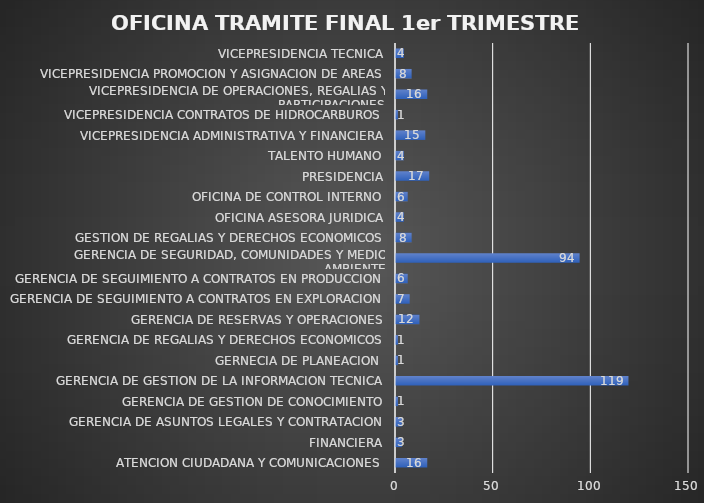
| Category | Series 0 |
|---|---|
| ATENCION CIUDADANA Y COMUNICACIONES | 16 |
| FINANCIERA | 3 |
| GERENCIA DE ASUNTOS LEGALES Y CONTRATACION | 3 |
| GERENCIA DE GESTION DE CONOCIMIENTO | 1 |
| GERENCIA DE GESTION DE LA INFORMACION TECNICA | 119 |
| GERNECIA DE PLANEACION  | 1 |
| GERENCIA DE REGALIAS Y DERECHOS ECONOMICOS | 1 |
| GERENCIA DE RESERVAS Y OPERACIONES | 12 |
| GERENCIA DE SEGUIMIENTO A CONTRATOS EN EXPLORACION | 7 |
| GERENCIA DE SEGUIMIENTO A CONTRATOS EN PRODUCCION | 6 |
| GERENCIA DE SEGURIDAD, COMUNIDADES Y MEDIO AMBIENTE | 94 |
| GESTION DE REGALIAS Y DERECHOS ECONOMICOS | 8 |
| OFICINA ASESORA JURIDICA | 4 |
| OFICINA DE CONTROL INTERNO | 6 |
| PRESIDENCIA | 17 |
| TALENTO HUMANO | 4 |
| VICEPRESIDENCIA ADMINISTRATIVA Y FINANCIERA | 15 |
| VICEPRESIDENCIA CONTRATOS DE HIDROCARBUROS | 1 |
| VICEPRESIDENCIA DE OPERACIONES, REGALIAS Y PARTICIPACIONES | 16 |
| VICEPRESIDENCIA PROMOCION Y ASIGNACION DE AREAS | 8 |
| VICEPRESIDENCIA TECNICA | 4 |